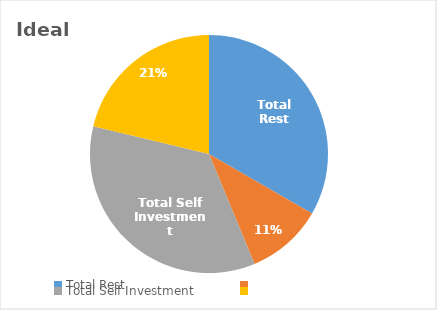
| Category | Ideal |
|---|---|
| Total Rest | 8 |
| Total Self Investment | 2.5 |
| Total Fixed | 8.4 |
| Remaining time | 5.1 |